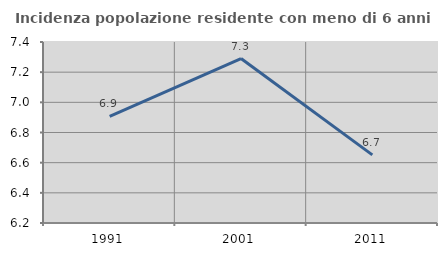
| Category | Incidenza popolazione residente con meno di 6 anni |
|---|---|
| 1991.0 | 6.908 |
| 2001.0 | 7.29 |
| 2011.0 | 6.652 |